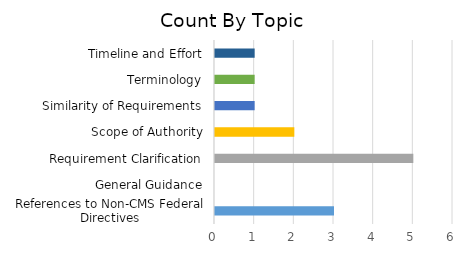
| Category | Count |
|---|---|
| References to Non-CMS Federal Directives | 3 |
| General Guidance | 0 |
| Requirement Clarification | 5 |
| Scope of Authority | 2 |
| Similarity of Requirements | 1 |
| Terminology | 1 |
| Timeline and Effort | 1 |